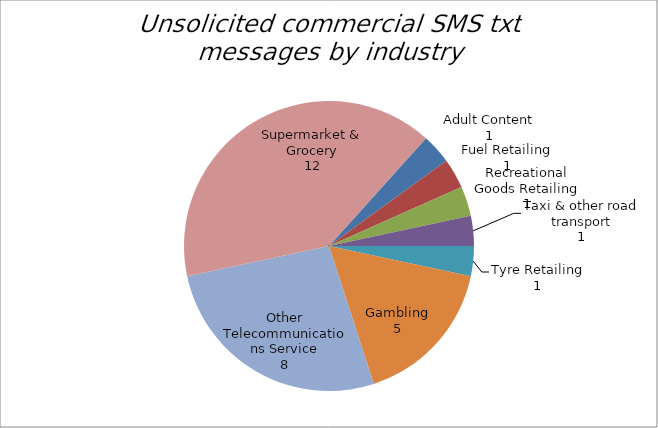
| Category | Series 0 |
|---|---|
| Adult Content | 1 |
| Fuel Retailing | 1 |
| Recreational Goods Retailing | 1 |
| Taxi & other road transport | 1 |
| Tyre Retailing | 1 |
| Gambling | 5 |
| Other Telecommunications Service | 8 |
| Supermarket & Grocery | 12 |